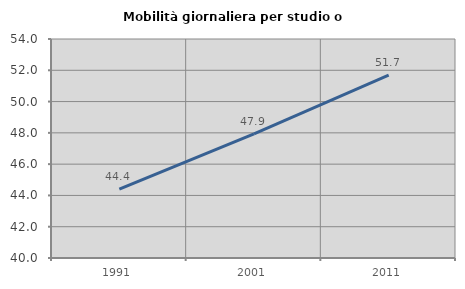
| Category | Mobilità giornaliera per studio o lavoro |
|---|---|
| 1991.0 | 44.406 |
| 2001.0 | 47.937 |
| 2011.0 | 51.686 |